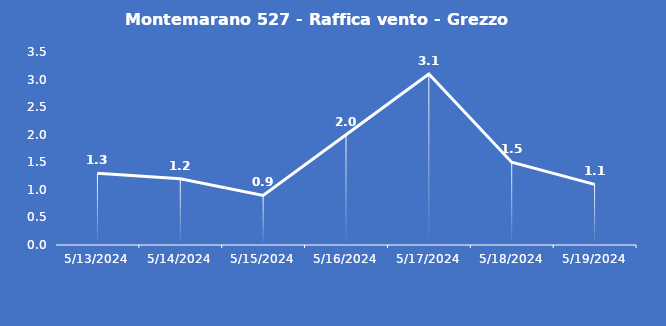
| Category | Montemarano 527 - Raffica vento - Grezzo (m/s) |
|---|---|
| 5/13/24 | 1.3 |
| 5/14/24 | 1.2 |
| 5/15/24 | 0.9 |
| 5/16/24 | 2 |
| 5/17/24 | 3.1 |
| 5/18/24 | 1.5 |
| 5/19/24 | 1.1 |